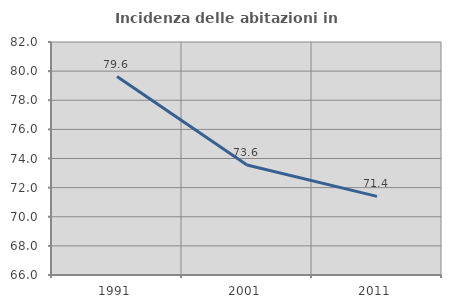
| Category | Incidenza delle abitazioni in proprietà  |
|---|---|
| 1991.0 | 79.624 |
| 2001.0 | 73.554 |
| 2011.0 | 71.397 |